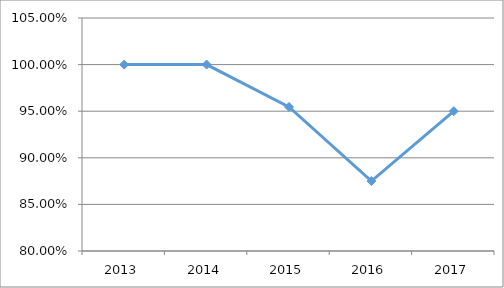
| Category | SIOP-R1O43 |
|---|---|
| 2013.0 | 1 |
| 2014.0 | 1 |
| 2015.0 | 0.955 |
| 2016.0 | 0.875 |
| 2017.0 | 0.95 |